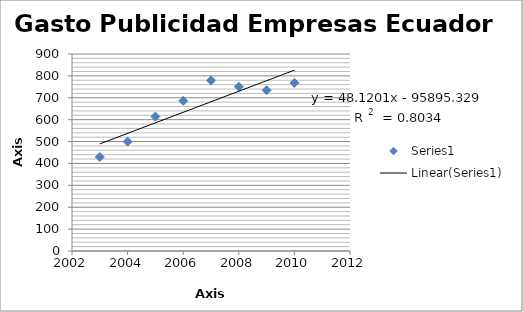
| Category | Series 0 |
|---|---|
| 2003.0 | 429.56 |
| 2004.0 | 499.817 |
| 2005.0 | 614.254 |
| 2006.0 | 686.114 |
| 2007.0 | 779.207 |
| 2008.0 | 750.567 |
| 2009.0 | 734.138 |
| 2010.0 | 767.91 |